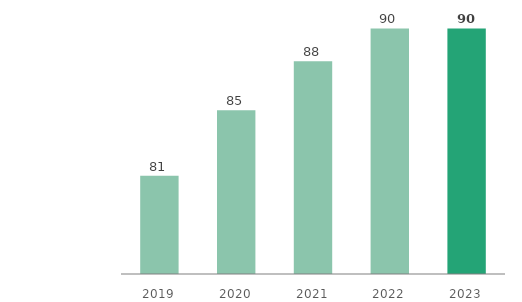
| Category | Assets in Kazakhstan |
|---|---|
| 2019.0 | 81 |
| 2020.0 | 85 |
| 2021.0 | 88 |
| 2022.0 | 90 |
| 2023.0 | 90 |